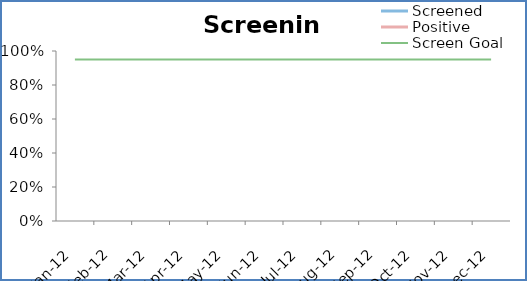
| Category | Screened | Positive | MedianS | MedianP | Screen Goal |
|---|---|---|---|---|---|
| 2012-01-01 |  |  | 0 | 0 | 0.95 |
| 2012-02-01 |  |  | 0 | 0 | 0.95 |
| 2012-03-01 |  |  | 0 | 0 | 0.95 |
| 2012-04-01 |  |  | 0 | 0 | 0.95 |
| 2012-05-01 |  |  | 0 | 0 | 0.95 |
| 2012-06-01 |  |  | 0 | 0 | 0.95 |
| 2012-07-01 |  |  | 0 | 0 | 0.95 |
| 2012-08-01 |  |  | 0 | 0 | 0.95 |
| 2012-09-01 |  |  | 0 | 0 | 0.95 |
| 2012-10-01 |  |  | 0 | 0 | 0.95 |
| 2012-11-01 |  |  | 0 | 0 | 0.95 |
| 2012-12-01 |  |  | 0 | 0 | 0.95 |